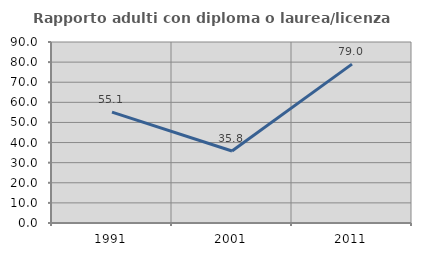
| Category | Rapporto adulti con diploma o laurea/licenza media  |
|---|---|
| 1991.0 | 55.102 |
| 2001.0 | 35.789 |
| 2011.0 | 79.012 |